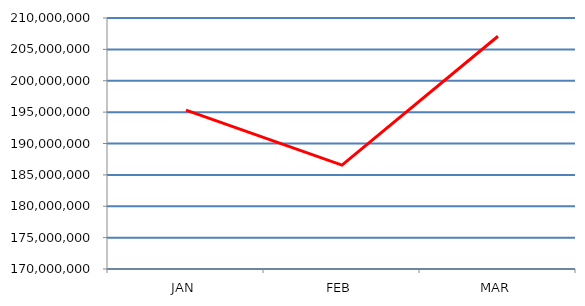
| Category | Series 0 |
|---|---|
| JAN | 195317765 |
| FEB | 186562468 |
| MAR | 207091212 |